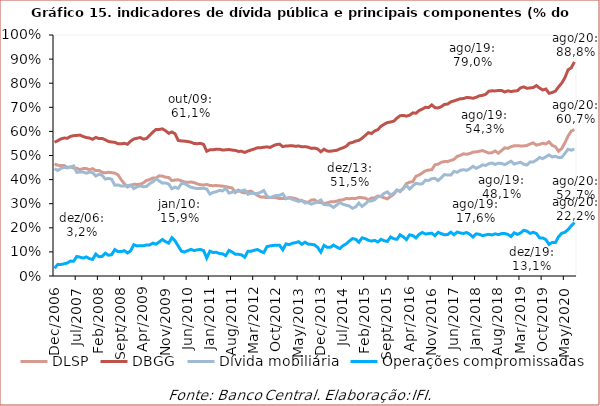
| Category | DLSP | DBGG | Dívida mobiliária | Operações compromissadas |
|---|---|---|---|---|
| 2006-12-01 | 0.465 | 0.555 | 0.446 | 0.032 |
| 2007-01-01 | 0.459 | 0.562 | 0.438 | 0.048 |
| 2007-02-01 | 0.459 | 0.569 | 0.446 | 0.048 |
| 2007-03-01 | 0.458 | 0.572 | 0.451 | 0.05 |
| 2007-04-01 | 0.451 | 0.572 | 0.448 | 0.054 |
| 2007-05-01 | 0.452 | 0.579 | 0.452 | 0.062 |
| 2007-06-01 | 0.448 | 0.582 | 0.457 | 0.061 |
| 2007-07-01 | 0.447 | 0.583 | 0.43 | 0.081 |
| 2007-08-01 | 0.441 | 0.585 | 0.432 | 0.078 |
| 2007-09-01 | 0.446 | 0.579 | 0.431 | 0.074 |
| 2007-10-01 | 0.446 | 0.575 | 0.427 | 0.079 |
| 2007-11-01 | 0.441 | 0.572 | 0.431 | 0.072 |
| 2007-12-01 | 0.445 | 0.567 | 0.429 | 0.069 |
| 2008-01-01 | 0.437 | 0.575 | 0.415 | 0.091 |
| 2008-02-01 | 0.438 | 0.57 | 0.422 | 0.08 |
| 2008-03-01 | 0.43 | 0.571 | 0.418 | 0.081 |
| 2008-04-01 | 0.428 | 0.565 | 0.402 | 0.095 |
| 2008-05-01 | 0.43 | 0.558 | 0.405 | 0.086 |
| 2008-06-01 | 0.429 | 0.556 | 0.402 | 0.088 |
| 2008-07-01 | 0.427 | 0.555 | 0.377 | 0.11 |
| 2008-08-01 | 0.42 | 0.549 | 0.378 | 0.101 |
| 2008-09-01 | 0.4 | 0.548 | 0.373 | 0.101 |
| 2008-10-01 | 0.383 | 0.551 | 0.373 | 0.105 |
| 2008-11-01 | 0.37 | 0.547 | 0.375 | 0.095 |
| 2008-12-01 | 0.376 | 0.56 | 0.378 | 0.105 |
| 2009-01-01 | 0.38 | 0.569 | 0.363 | 0.13 |
| 2009-02-01 | 0.38 | 0.572 | 0.37 | 0.125 |
| 2009-03-01 | 0.38 | 0.575 | 0.374 | 0.126 |
| 2009-04-01 | 0.386 | 0.568 | 0.37 | 0.125 |
| 2009-05-01 | 0.397 | 0.571 | 0.371 | 0.129 |
| 2009-06-01 | 0.4 | 0.583 | 0.383 | 0.129 |
| 2009-07-01 | 0.407 | 0.597 | 0.391 | 0.136 |
| 2009-08-01 | 0.407 | 0.608 | 0.403 | 0.132 |
| 2009-09-01 | 0.416 | 0.608 | 0.394 | 0.141 |
| 2009-10-01 | 0.415 | 0.611 | 0.385 | 0.152 |
| 2009-11-01 | 0.41 | 0.603 | 0.386 | 0.143 |
| 2009-12-01 | 0.409 | 0.592 | 0.382 | 0.136 |
| 2010-01-01 | 0.396 | 0.598 | 0.362 | 0.159 |
| 2010-02-01 | 0.398 | 0.59 | 0.369 | 0.146 |
| 2010-03-01 | 0.399 | 0.562 | 0.364 | 0.125 |
| 2010-04-01 | 0.395 | 0.561 | 0.383 | 0.103 |
| 2010-05-01 | 0.39 | 0.56 | 0.384 | 0.1 |
| 2010-06-01 | 0.389 | 0.558 | 0.376 | 0.105 |
| 2010-07-01 | 0.39 | 0.555 | 0.368 | 0.111 |
| 2010-08-01 | 0.388 | 0.55 | 0.366 | 0.106 |
| 2010-09-01 | 0.382 | 0.549 | 0.363 | 0.108 |
| 2010-10-01 | 0.379 | 0.551 | 0.363 | 0.11 |
| 2010-11-01 | 0.377 | 0.546 | 0.364 | 0.106 |
| 2010-12-01 | 0.38 | 0.518 | 0.361 | 0.074 |
| 2011-01-01 | 0.376 | 0.524 | 0.34 | 0.103 |
| 2011-02-01 | 0.375 | 0.524 | 0.347 | 0.098 |
| 2011-03-01 | 0.375 | 0.526 | 0.35 | 0.098 |
| 2011-04-01 | 0.374 | 0.526 | 0.355 | 0.093 |
| 2011-05-01 | 0.373 | 0.523 | 0.353 | 0.092 |
| 2011-06-01 | 0.371 | 0.524 | 0.364 | 0.084 |
| 2011-07-01 | 0.368 | 0.525 | 0.344 | 0.106 |
| 2011-08-01 | 0.365 | 0.523 | 0.347 | 0.1 |
| 2011-09-01 | 0.347 | 0.521 | 0.353 | 0.09 |
| 2011-10-01 | 0.356 | 0.517 | 0.352 | 0.09 |
| 2011-11-01 | 0.348 | 0.517 | 0.353 | 0.087 |
| 2011-12-01 | 0.345 | 0.513 | 0.357 | 0.078 |
| 2012-01-01 | 0.35 | 0.519 | 0.339 | 0.103 |
| 2012-02-01 | 0.352 | 0.523 | 0.343 | 0.103 |
| 2012-03-01 | 0.343 | 0.527 | 0.342 | 0.107 |
| 2012-04-01 | 0.335 | 0.532 | 0.342 | 0.11 |
| 2012-05-01 | 0.327 | 0.532 | 0.347 | 0.103 |
| 2012-06-01 | 0.328 | 0.534 | 0.355 | 0.097 |
| 2012-07-01 | 0.325 | 0.536 | 0.331 | 0.122 |
| 2012-08-01 | 0.326 | 0.533 | 0.325 | 0.125 |
| 2012-09-01 | 0.326 | 0.541 | 0.33 | 0.127 |
| 2012-10-01 | 0.325 | 0.546 | 0.334 | 0.128 |
| 2012-11-01 | 0.321 | 0.547 | 0.335 | 0.127 |
| 2012-12-01 | 0.322 | 0.537 | 0.341 | 0.109 |
| 2013-01-01 | 0.322 | 0.54 | 0.321 | 0.133 |
| 2013-02-01 | 0.326 | 0.54 | 0.323 | 0.13 |
| 2013-03-01 | 0.324 | 0.541 | 0.318 | 0.136 |
| 2013-04-01 | 0.322 | 0.538 | 0.314 | 0.138 |
| 2013-05-01 | 0.315 | 0.54 | 0.309 | 0.142 |
| 2013-06-01 | 0.312 | 0.536 | 0.314 | 0.131 |
| 2013-07-01 | 0.308 | 0.537 | 0.303 | 0.14 |
| 2013-08-01 | 0.306 | 0.534 | 0.304 | 0.133 |
| 2013-09-01 | 0.315 | 0.529 | 0.298 | 0.131 |
| 2013-10-01 | 0.316 | 0.531 | 0.303 | 0.129 |
| 2013-11-01 | 0.306 | 0.527 | 0.308 | 0.118 |
| 2013-12-01 | 0.305 | 0.515 | 0.315 | 0.099 |
| 2014-01-01 | 0.3 | 0.526 | 0.296 | 0.127 |
| 2014-02-01 | 0.304 | 0.518 | 0.296 | 0.119 |
| 2014-03-01 | 0.308 | 0.518 | 0.293 | 0.119 |
| 2014-04-01 | 0.308 | 0.52 | 0.284 | 0.128 |
| 2014-05-01 | 0.311 | 0.521 | 0.294 | 0.12 |
| 2014-06-01 | 0.315 | 0.527 | 0.305 | 0.114 |
| 2014-07-01 | 0.316 | 0.532 | 0.298 | 0.126 |
| 2014-08-01 | 0.321 | 0.538 | 0.294 | 0.133 |
| 2014-09-01 | 0.321 | 0.551 | 0.29 | 0.145 |
| 2014-10-01 | 0.322 | 0.554 | 0.281 | 0.155 |
| 2014-11-01 | 0.322 | 0.56 | 0.287 | 0.152 |
| 2014-12-01 | 0.326 | 0.563 | 0.303 | 0.14 |
| 2015-01-01 | 0.325 | 0.572 | 0.289 | 0.158 |
| 2015-02-01 | 0.323 | 0.583 | 0.299 | 0.155 |
| 2015-03-01 | 0.316 | 0.595 | 0.311 | 0.148 |
| 2015-04-01 | 0.323 | 0.591 | 0.311 | 0.145 |
| 2015-05-01 | 0.324 | 0.602 | 0.316 | 0.148 |
| 2015-06-01 | 0.332 | 0.607 | 0.33 | 0.141 |
| 2015-07-01 | 0.329 | 0.622 | 0.332 | 0.152 |
| 2015-08-01 | 0.325 | 0.63 | 0.343 | 0.146 |
| 2015-09-01 | 0.32 | 0.636 | 0.349 | 0.143 |
| 2015-10-01 | 0.33 | 0.639 | 0.336 | 0.162 |
| 2015-11-01 | 0.339 | 0.643 | 0.343 | 0.155 |
| 2015-12-01 | 0.356 | 0.655 | 0.357 | 0.152 |
| 2016-01-01 | 0.353 | 0.665 | 0.349 | 0.171 |
| 2016-02-01 | 0.363 | 0.666 | 0.362 | 0.163 |
| 2016-03-01 | 0.383 | 0.663 | 0.376 | 0.151 |
| 2016-04-01 | 0.389 | 0.667 | 0.361 | 0.171 |
| 2016-05-01 | 0.392 | 0.677 | 0.374 | 0.168 |
| 2016-06-01 | 0.414 | 0.675 | 0.385 | 0.158 |
| 2016-07-01 | 0.419 | 0.687 | 0.382 | 0.173 |
| 2016-08-01 | 0.428 | 0.692 | 0.382 | 0.181 |
| 2016-09-01 | 0.436 | 0.7 | 0.398 | 0.174 |
| 2016-10-01 | 0.44 | 0.699 | 0.396 | 0.176 |
| 2016-11-01 | 0.441 | 0.71 | 0.404 | 0.178 |
| 2016-12-01 | 0.461 | 0.698 | 0.405 | 0.167 |
| 2017-01-01 | 0.464 | 0.697 | 0.396 | 0.181 |
| 2017-02-01 | 0.472 | 0.703 | 0.408 | 0.176 |
| 2017-03-01 | 0.475 | 0.712 | 0.421 | 0.171 |
| 2017-04-01 | 0.475 | 0.713 | 0.419 | 0.172 |
| 2017-05-01 | 0.48 | 0.723 | 0.419 | 0.182 |
| 2017-06-01 | 0.484 | 0.726 | 0.434 | 0.171 |
| 2017-07-01 | 0.496 | 0.731 | 0.43 | 0.182 |
| 2017-08-01 | 0.5 | 0.735 | 0.438 | 0.178 |
| 2017-09-01 | 0.507 | 0.736 | 0.441 | 0.177 |
| 2017-10-01 | 0.505 | 0.741 | 0.438 | 0.18 |
| 2017-11-01 | 0.508 | 0.74 | 0.445 | 0.173 |
| 2017-12-01 | 0.514 | 0.737 | 0.455 | 0.162 |
| 2018-01-01 | 0.515 | 0.741 | 0.447 | 0.175 |
| 2018-02-01 | 0.518 | 0.748 | 0.453 | 0.173 |
| 2018-03-01 | 0.521 | 0.749 | 0.461 | 0.168 |
| 2018-04-01 | 0.515 | 0.754 | 0.459 | 0.17 |
| 2018-05-01 | 0.51 | 0.767 | 0.466 | 0.173 |
| 2018-06-01 | 0.512 | 0.768 | 0.469 | 0.17 |
| 2018-07-01 | 0.519 | 0.768 | 0.463 | 0.175 |
| 2018-08-01 | 0.51 | 0.77 | 0.468 | 0.172 |
| 2018-09-01 | 0.52 | 0.77 | 0.467 | 0.176 |
| 2018-10-01 | 0.532 | 0.763 | 0.462 | 0.176 |
| 2018-11-01 | 0.53 | 0.768 | 0.469 | 0.173 |
| 2018-12-01 | 0.536 | 0.765 | 0.476 | 0.164 |
| 2019-01-01 | 0.54 | 0.768 | 0.464 | 0.179 |
| 2019-02-01 | 0.54 | 0.769 | 0.469 | 0.173 |
| 2019-03-01 | 0.54 | 0.781 | 0.472 | 0.179 |
| 2019-04-01 | 0.54 | 0.785 | 0.464 | 0.19 |
| 2019-05-01 | 0.542 | 0.779 | 0.461 | 0.186 |
| 2019-06-01 | 0.548 | 0.78 | 0.473 | 0.177 |
| 2019-07-01 | 0.552 | 0.782 | 0.473 | 0.181 |
| 2019-08-01 | 0.543 | 0.79 | 0.481 | 0.176 |
| 2019-09-01 | 0.546 | 0.78 | 0.492 | 0.158 |
| 2019-10-01 | 0.551 | 0.772 | 0.487 | 0.158 |
| 2019-11-01 | 0.548 | 0.776 | 0.495 | 0.151 |
| 2019-12-01 | 0.557 | 0.758 | 0.502 | 0.131 |
| 2020-01-01 | 0.542 | 0.762 | 0.494 | 0.139 |
| 2020-02-01 | 0.536 | 0.767 | 0.497 | 0.139 |
| 2020-03-01 | 0.518 | 0.785 | 0.491 | 0.163 |
| 2020-04-01 | 0.529 | 0.8 | 0.492 | 0.177 |
| 2020-05-01 | 0.553 | 0.823 | 0.509 | 0.182 |
| 2020-06-01 | 0.581 | 0.856 | 0.526 | 0.193 |
| 2020-07-01 | 0.601 | 0.864 | 0.522 | 0.208 |
| 2020-08-01 | 0.607 | 0.888 | 0.527 | 0.222 |